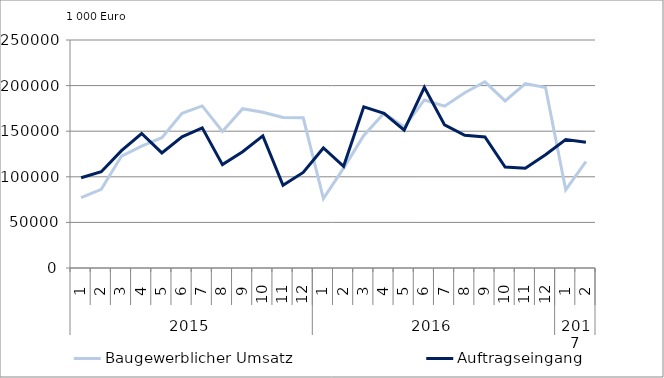
| Category | Baugewerblicher Umsatz | Auftragseingang |
|---|---|---|
| 0 | 77137.228 | 99023.008 |
| 1 | 86257.027 | 105491.844 |
| 2 | 122760.234 | 128704.324 |
| 3 | 133614.814 | 147438.665 |
| 4 | 142869.83 | 126182.175 |
| 5 | 169564.381 | 143879.815 |
| 6 | 177708.819 | 153660.001 |
| 7 | 149762.789 | 113338.261 |
| 8 | 174633.481 | 127520.775 |
| 9 | 170827.145 | 144931.886 |
| 10 | 165122.384 | 90621.16 |
| 11 | 164674.971 | 104795.622 |
| 12 | 76043.538 | 131571.482 |
| 13 | 109483.268 | 111467.248 |
| 14 | 145343.559 | 176673.268 |
| 15 | 169660.551 | 169566.96 |
| 16 | 154554.865 | 151228.165 |
| 17 | 184236.137 | 198035.655 |
| 18 | 177444.278 | 156900.898 |
| 19 | 192230.472 | 145537.167 |
| 20 | 204178.065 | 143616.217 |
| 21 | 183173.849 | 110770.94 |
| 22 | 202302.279 | 109384.188 |
| 23 | 197832.096 | 124193.91 |
| 24 | 85701.947 | 140751.008 |
| 25 | 116743.276 | 137863.383 |